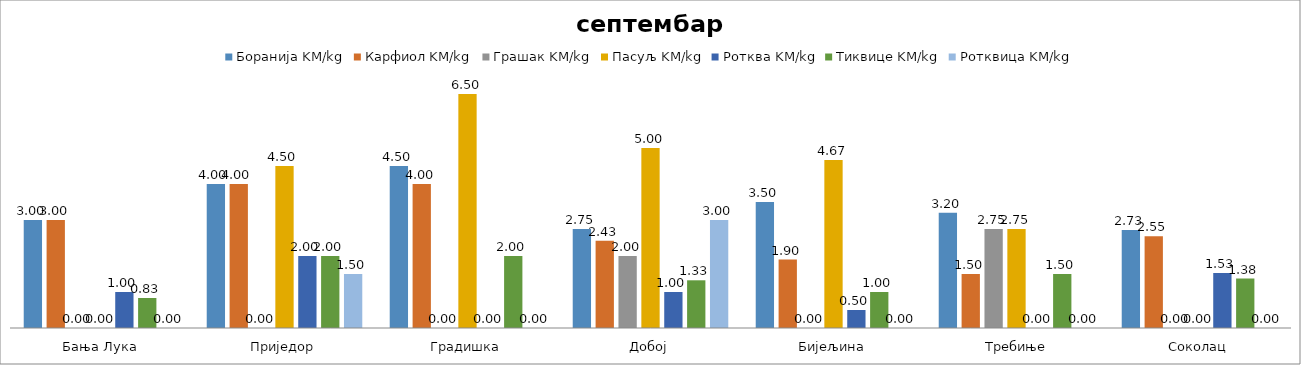
| Category | Боранија KM/kg | Карфиол KM/kg | Грашак KM/kg | Пасуљ KM/kg | Ротква KM/kg | Тиквице KM/kg | Ротквица KM/kg |
|---|---|---|---|---|---|---|---|
| Бања Лука | 3 | 3 | 0 | 0 | 1 | 0.833 | 0 |
| Приједор | 4 | 4 | 0 | 4.5 | 2 | 2 | 1.5 |
| Градишка | 4.5 | 4 | 0 | 6.5 | 0 | 2 | 0 |
| Добој | 2.75 | 2.425 | 2 | 5 | 1 | 1.325 | 3 |
| Бијељина | 3.5 | 1.9 | 0 | 4.667 | 0.5 | 1 | 0 |
|  Требиње | 3.2 | 1.5 | 2.75 | 2.75 | 0 | 1.5 | 0 |
| Соколац | 2.725 | 2.55 | 0 | 0 | 1.525 | 1.375 | 0 |